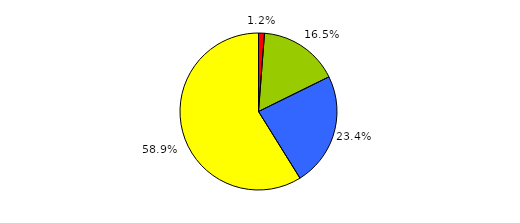
| Category | Series 0 |
|---|---|
| 0 | 6 |
| 1 | 81 |
| 2 | 115 |
| 3 | 289 |